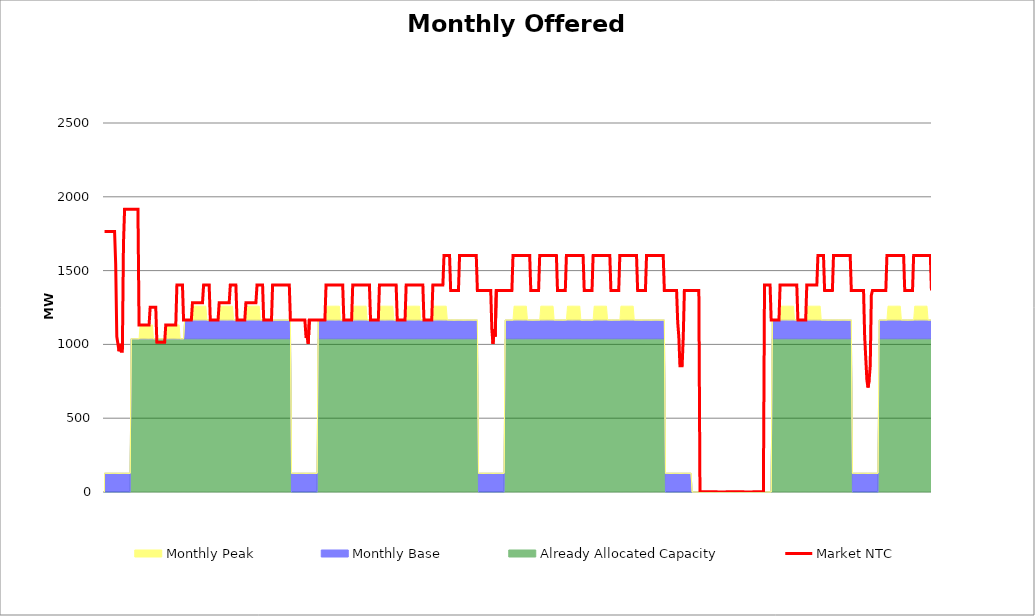
| Category | Market NTC |
|---|---|
| 0 | 1765 |
| 1 | 1765 |
| 2 | 1765 |
| 3 | 1765 |
| 4 | 1765 |
| 5 | 1765 |
| 6 | 1765 |
| 7 | 1765 |
| 8 | 1765 |
| 9 | 1765 |
| 10 | 1545 |
| 11 | 1053 |
| 12 | 1004 |
| 13 | 954 |
| 14 | 1004 |
| 15 | 954 |
| 16 | 954 |
| 17 | 1682 |
| 18 | 1915 |
| 19 | 1915 |
| 20 | 1915 |
| 21 | 1915 |
| 22 | 1915 |
| 23 | 1915 |
| 24 | 1915 |
| 25 | 1915 |
| 26 | 1915 |
| 27 | 1915 |
| 28 | 1915 |
| 29 | 1915 |
| 30 | 1915 |
| 31 | 1132 |
| 32 | 1132 |
| 33 | 1132 |
| 34 | 1132 |
| 35 | 1132 |
| 36 | 1132 |
| 37 | 1132 |
| 38 | 1132 |
| 39 | 1132 |
| 40 | 1132 |
| 41 | 1252 |
| 42 | 1252 |
| 43 | 1252 |
| 44 | 1252 |
| 45 | 1252 |
| 46 | 1252 |
| 47 | 1015 |
| 48 | 1015 |
| 49 | 1015 |
| 50 | 1015 |
| 51 | 1015 |
| 52 | 1015 |
| 53 | 1015 |
| 54 | 1015 |
| 55 | 1132 |
| 56 | 1132 |
| 57 | 1132 |
| 58 | 1132 |
| 59 | 1132 |
| 60 | 1132 |
| 61 | 1132 |
| 62 | 1132 |
| 63 | 1132 |
| 64 | 1132 |
| 65 | 1402 |
| 66 | 1402 |
| 67 | 1402 |
| 68 | 1402 |
| 69 | 1402 |
| 70 | 1402 |
| 71 | 1165 |
| 72 | 1165 |
| 73 | 1165 |
| 74 | 1165 |
| 75 | 1165 |
| 76 | 1165 |
| 77 | 1165 |
| 78 | 1165 |
| 79 | 1282 |
| 80 | 1282 |
| 81 | 1282 |
| 82 | 1282 |
| 83 | 1282 |
| 84 | 1282 |
| 85 | 1282 |
| 86 | 1282 |
| 87 | 1282 |
| 88 | 1282 |
| 89 | 1402 |
| 90 | 1402 |
| 91 | 1402 |
| 92 | 1402 |
| 93 | 1402 |
| 94 | 1402 |
| 95 | 1165 |
| 96 | 1165 |
| 97 | 1165 |
| 98 | 1165 |
| 99 | 1165 |
| 100 | 1165 |
| 101 | 1165 |
| 102 | 1165 |
| 103 | 1282 |
| 104 | 1282 |
| 105 | 1282 |
| 106 | 1282 |
| 107 | 1282 |
| 108 | 1282 |
| 109 | 1282 |
| 110 | 1282 |
| 111 | 1282 |
| 112 | 1282 |
| 113 | 1402 |
| 114 | 1402 |
| 115 | 1402 |
| 116 | 1402 |
| 117 | 1402 |
| 118 | 1402 |
| 119 | 1165 |
| 120 | 1165 |
| 121 | 1165 |
| 122 | 1165 |
| 123 | 1165 |
| 124 | 1165 |
| 125 | 1165 |
| 126 | 1165 |
| 127 | 1282 |
| 128 | 1282 |
| 129 | 1282 |
| 130 | 1282 |
| 131 | 1282 |
| 132 | 1282 |
| 133 | 1282 |
| 134 | 1282 |
| 135 | 1282 |
| 136 | 1282 |
| 137 | 1402 |
| 138 | 1402 |
| 139 | 1402 |
| 140 | 1402 |
| 141 | 1402 |
| 142 | 1402 |
| 143 | 1165 |
| 144 | 1165 |
| 145 | 1165 |
| 146 | 1165 |
| 147 | 1165 |
| 148 | 1165 |
| 149 | 1165 |
| 150 | 1165 |
| 151 | 1402 |
| 152 | 1402 |
| 153 | 1402 |
| 154 | 1402 |
| 155 | 1402 |
| 156 | 1402 |
| 157 | 1402 |
| 158 | 1402 |
| 159 | 1402 |
| 160 | 1402 |
| 161 | 1402 |
| 162 | 1402 |
| 163 | 1402 |
| 164 | 1402 |
| 165 | 1402 |
| 166 | 1402 |
| 167 | 1165 |
| 168 | 1165 |
| 169 | 1165 |
| 170 | 1165 |
| 171 | 1165 |
| 172 | 1165 |
| 173 | 1165 |
| 174 | 1165 |
| 175 | 1165 |
| 176 | 1165 |
| 177 | 1165 |
| 178 | 1165 |
| 179 | 1165 |
| 180 | 1165 |
| 181 | 1053 |
| 182 | 1053 |
| 183 | 1004 |
| 184 | 1165 |
| 185 | 1165 |
| 186 | 1165 |
| 187 | 1165 |
| 188 | 1165 |
| 189 | 1165 |
| 190 | 1165 |
| 191 | 1165 |
| 192 | 1165 |
| 193 | 1165 |
| 194 | 1165 |
| 195 | 1165 |
| 196 | 1165 |
| 197 | 1165 |
| 198 | 1165 |
| 199 | 1402 |
| 200 | 1402 |
| 201 | 1402 |
| 202 | 1402 |
| 203 | 1402 |
| 204 | 1402 |
| 205 | 1402 |
| 206 | 1402 |
| 207 | 1402 |
| 208 | 1402 |
| 209 | 1402 |
| 210 | 1402 |
| 211 | 1402 |
| 212 | 1402 |
| 213 | 1402 |
| 214 | 1402 |
| 215 | 1165 |
| 216 | 1165 |
| 217 | 1165 |
| 218 | 1165 |
| 219 | 1165 |
| 220 | 1165 |
| 221 | 1165 |
| 222 | 1165 |
| 223 | 1402 |
| 224 | 1402 |
| 225 | 1402 |
| 226 | 1402 |
| 227 | 1402 |
| 228 | 1402 |
| 229 | 1402 |
| 230 | 1402 |
| 231 | 1402 |
| 232 | 1402 |
| 233 | 1402 |
| 234 | 1402 |
| 235 | 1402 |
| 236 | 1402 |
| 237 | 1402 |
| 238 | 1402 |
| 239 | 1165 |
| 240 | 1165 |
| 241 | 1165 |
| 242 | 1165 |
| 243 | 1165 |
| 244 | 1165 |
| 245 | 1165 |
| 246 | 1165 |
| 247 | 1402 |
| 248 | 1402 |
| 249 | 1402 |
| 250 | 1402 |
| 251 | 1402 |
| 252 | 1402 |
| 253 | 1402 |
| 254 | 1402 |
| 255 | 1402 |
| 256 | 1402 |
| 257 | 1402 |
| 258 | 1402 |
| 259 | 1402 |
| 260 | 1402 |
| 261 | 1402 |
| 262 | 1402 |
| 263 | 1165 |
| 264 | 1165 |
| 265 | 1165 |
| 266 | 1165 |
| 267 | 1165 |
| 268 | 1165 |
| 269 | 1165 |
| 270 | 1165 |
| 271 | 1402 |
| 272 | 1402 |
| 273 | 1402 |
| 274 | 1402 |
| 275 | 1402 |
| 276 | 1402 |
| 277 | 1402 |
| 278 | 1402 |
| 279 | 1402 |
| 280 | 1402 |
| 281 | 1402 |
| 282 | 1402 |
| 283 | 1402 |
| 284 | 1402 |
| 285 | 1402 |
| 286 | 1402 |
| 287 | 1165 |
| 288 | 1165 |
| 289 | 1165 |
| 290 | 1165 |
| 291 | 1165 |
| 292 | 1165 |
| 293 | 1165 |
| 294 | 1165 |
| 295 | 1402 |
| 296 | 1402 |
| 297 | 1402 |
| 298 | 1402 |
| 299 | 1402 |
| 300 | 1402 |
| 301 | 1402 |
| 302 | 1402 |
| 303 | 1402 |
| 304 | 1402 |
| 305 | 1602 |
| 306 | 1602 |
| 307 | 1602 |
| 308 | 1602 |
| 309 | 1602 |
| 310 | 1602 |
| 311 | 1365 |
| 312 | 1365 |
| 313 | 1365 |
| 314 | 1365 |
| 315 | 1365 |
| 316 | 1365 |
| 317 | 1365 |
| 318 | 1365 |
| 319 | 1602 |
| 320 | 1602 |
| 321 | 1602 |
| 322 | 1602 |
| 323 | 1602 |
| 324 | 1602 |
| 325 | 1602 |
| 326 | 1602 |
| 327 | 1602 |
| 328 | 1602 |
| 329 | 1602 |
| 330 | 1602 |
| 331 | 1602 |
| 332 | 1602 |
| 333 | 1602 |
| 334 | 1602 |
| 335 | 1365 |
| 336 | 1365 |
| 337 | 1365 |
| 338 | 1365 |
| 339 | 1365 |
| 340 | 1365 |
| 341 | 1365 |
| 342 | 1365 |
| 343 | 1365 |
| 344 | 1365 |
| 345 | 1365 |
| 346 | 1365 |
| 347 | 1365 |
| 348 | 1102 |
| 349 | 1004 |
| 350 | 1102 |
| 351 | 1053 |
| 352 | 1365 |
| 353 | 1365 |
| 354 | 1365 |
| 355 | 1365 |
| 356 | 1365 |
| 357 | 1365 |
| 358 | 1365 |
| 359 | 1365 |
| 360 | 1365 |
| 361 | 1365 |
| 362 | 1365 |
| 363 | 1365 |
| 364 | 1365 |
| 365 | 1365 |
| 366 | 1365 |
| 367 | 1602 |
| 368 | 1602 |
| 369 | 1602 |
| 370 | 1602 |
| 371 | 1602 |
| 372 | 1602 |
| 373 | 1602 |
| 374 | 1602 |
| 375 | 1602 |
| 376 | 1602 |
| 377 | 1602 |
| 378 | 1602 |
| 379 | 1602 |
| 380 | 1602 |
| 381 | 1602 |
| 382 | 1602 |
| 383 | 1365 |
| 384 | 1365 |
| 385 | 1365 |
| 386 | 1365 |
| 387 | 1365 |
| 388 | 1365 |
| 389 | 1365 |
| 390 | 1365 |
| 391 | 1602 |
| 392 | 1602 |
| 393 | 1602 |
| 394 | 1602 |
| 395 | 1602 |
| 396 | 1602 |
| 397 | 1602 |
| 398 | 1602 |
| 399 | 1602 |
| 400 | 1602 |
| 401 | 1602 |
| 402 | 1602 |
| 403 | 1602 |
| 404 | 1602 |
| 405 | 1602 |
| 406 | 1602 |
| 407 | 1365 |
| 408 | 1365 |
| 409 | 1365 |
| 410 | 1365 |
| 411 | 1365 |
| 412 | 1365 |
| 413 | 1365 |
| 414 | 1365 |
| 415 | 1602 |
| 416 | 1602 |
| 417 | 1602 |
| 418 | 1602 |
| 419 | 1602 |
| 420 | 1602 |
| 421 | 1602 |
| 422 | 1602 |
| 423 | 1602 |
| 424 | 1602 |
| 425 | 1602 |
| 426 | 1602 |
| 427 | 1602 |
| 428 | 1602 |
| 429 | 1602 |
| 430 | 1602 |
| 431 | 1365 |
| 432 | 1365 |
| 433 | 1365 |
| 434 | 1365 |
| 435 | 1365 |
| 436 | 1365 |
| 437 | 1365 |
| 438 | 1365 |
| 439 | 1602 |
| 440 | 1602 |
| 441 | 1602 |
| 442 | 1602 |
| 443 | 1602 |
| 444 | 1602 |
| 445 | 1602 |
| 446 | 1602 |
| 447 | 1602 |
| 448 | 1602 |
| 449 | 1602 |
| 450 | 1602 |
| 451 | 1602 |
| 452 | 1602 |
| 453 | 1602 |
| 454 | 1602 |
| 455 | 1365 |
| 456 | 1365 |
| 457 | 1365 |
| 458 | 1365 |
| 459 | 1365 |
| 460 | 1365 |
| 461 | 1365 |
| 462 | 1365 |
| 463 | 1602 |
| 464 | 1602 |
| 465 | 1602 |
| 466 | 1602 |
| 467 | 1602 |
| 468 | 1602 |
| 469 | 1602 |
| 470 | 1602 |
| 471 | 1602 |
| 472 | 1602 |
| 473 | 1602 |
| 474 | 1602 |
| 475 | 1602 |
| 476 | 1602 |
| 477 | 1602 |
| 478 | 1602 |
| 479 | 1365 |
| 480 | 1365 |
| 481 | 1365 |
| 482 | 1365 |
| 483 | 1365 |
| 484 | 1365 |
| 485 | 1365 |
| 486 | 1365 |
| 487 | 1602 |
| 488 | 1602 |
| 489 | 1602 |
| 490 | 1602 |
| 491 | 1602 |
| 492 | 1602 |
| 493 | 1602 |
| 494 | 1602 |
| 495 | 1602 |
| 496 | 1602 |
| 497 | 1602 |
| 498 | 1602 |
| 499 | 1602 |
| 500 | 1602 |
| 501 | 1602 |
| 502 | 1602 |
| 503 | 1365 |
| 504 | 1365 |
| 505 | 1365 |
| 506 | 1365 |
| 507 | 1365 |
| 508 | 1365 |
| 509 | 1365 |
| 510 | 1365 |
| 511 | 1365 |
| 512 | 1365 |
| 513 | 1365 |
| 514 | 1365 |
| 515 | 1151 |
| 516 | 1053 |
| 517 | 856 |
| 518 | 856 |
| 519 | 856 |
| 520 | 1053 |
| 521 | 1365 |
| 522 | 1365 |
| 523 | 1365 |
| 524 | 1365 |
| 525 | 1365 |
| 526 | 1365 |
| 527 | 1365 |
| 528 | 1365 |
| 529 | 1365 |
| 530 | 1365 |
| 531 | 1365 |
| 532 | 1365 |
| 533 | 1365 |
| 534 | 1365 |
| 535 | 2 |
| 536 | 2 |
| 537 | 2 |
| 538 | 2 |
| 539 | 2 |
| 540 | 2 |
| 541 | 2 |
| 542 | 2 |
| 543 | 2 |
| 544 | 2 |
| 545 | 2 |
| 546 | 2 |
| 547 | 2 |
| 548 | 2 |
| 549 | 2 |
| 550 | 2 |
| 551 | 0 |
| 552 | 0 |
| 553 | 0 |
| 554 | 0 |
| 555 | 0 |
| 556 | 0 |
| 557 | 0 |
| 558 | 0 |
| 559 | 2 |
| 560 | 2 |
| 561 | 2 |
| 562 | 2 |
| 563 | 2 |
| 564 | 2 |
| 565 | 2 |
| 566 | 2 |
| 567 | 2 |
| 568 | 2 |
| 569 | 2 |
| 570 | 2 |
| 571 | 2 |
| 572 | 2 |
| 573 | 2 |
| 574 | 2 |
| 575 | 0 |
| 576 | 0 |
| 577 | 0 |
| 578 | 0 |
| 579 | 0 |
| 580 | 0 |
| 581 | 0 |
| 582 | 0 |
| 583 | 2 |
| 584 | 2 |
| 585 | 2 |
| 586 | 2 |
| 587 | 2 |
| 588 | 2 |
| 589 | 2 |
| 590 | 2 |
| 591 | 2 |
| 592 | 2 |
| 593 | 1402 |
| 594 | 1402 |
| 595 | 1402 |
| 596 | 1402 |
| 597 | 1402 |
| 598 | 1402 |
| 599 | 1165 |
| 600 | 1165 |
| 601 | 1165 |
| 602 | 1165 |
| 603 | 1165 |
| 604 | 1165 |
| 605 | 1165 |
| 606 | 1165 |
| 607 | 1402 |
| 608 | 1402 |
| 609 | 1402 |
| 610 | 1402 |
| 611 | 1402 |
| 612 | 1402 |
| 613 | 1402 |
| 614 | 1402 |
| 615 | 1402 |
| 616 | 1402 |
| 617 | 1402 |
| 618 | 1402 |
| 619 | 1402 |
| 620 | 1402 |
| 621 | 1402 |
| 622 | 1402 |
| 623 | 1165 |
| 624 | 1165 |
| 625 | 1165 |
| 626 | 1165 |
| 627 | 1165 |
| 628 | 1165 |
| 629 | 1165 |
| 630 | 1165 |
| 631 | 1402 |
| 632 | 1402 |
| 633 | 1402 |
| 634 | 1402 |
| 635 | 1402 |
| 636 | 1402 |
| 637 | 1402 |
| 638 | 1402 |
| 639 | 1402 |
| 640 | 1402 |
| 641 | 1602 |
| 642 | 1602 |
| 643 | 1602 |
| 644 | 1602 |
| 645 | 1602 |
| 646 | 1602 |
| 647 | 1365 |
| 648 | 1365 |
| 649 | 1365 |
| 650 | 1365 |
| 651 | 1365 |
| 652 | 1365 |
| 653 | 1365 |
| 654 | 1365 |
| 655 | 1602 |
| 656 | 1602 |
| 657 | 1602 |
| 658 | 1602 |
| 659 | 1602 |
| 660 | 1602 |
| 661 | 1602 |
| 662 | 1602 |
| 663 | 1602 |
| 664 | 1602 |
| 665 | 1602 |
| 666 | 1602 |
| 667 | 1602 |
| 668 | 1602 |
| 669 | 1602 |
| 670 | 1602 |
| 671 | 1365 |
| 672 | 1365 |
| 673 | 1365 |
| 674 | 1365 |
| 675 | 1365 |
| 676 | 1365 |
| 677 | 1365 |
| 678 | 1365 |
| 679 | 1365 |
| 680 | 1365 |
| 681 | 1365 |
| 682 | 1365 |
| 683 | 1053 |
| 684 | 905 |
| 685 | 758 |
| 686 | 708 |
| 687 | 758 |
| 688 | 856 |
| 689 | 1333 |
| 690 | 1365 |
| 691 | 1365 |
| 692 | 1365 |
| 693 | 1365 |
| 694 | 1365 |
| 695 | 1365 |
| 696 | 1365 |
| 697 | 1365 |
| 698 | 1365 |
| 699 | 1365 |
| 700 | 1365 |
| 701 | 1365 |
| 702 | 1365 |
| 703 | 1602 |
| 704 | 1602 |
| 705 | 1602 |
| 706 | 1602 |
| 707 | 1602 |
| 708 | 1602 |
| 709 | 1602 |
| 710 | 1602 |
| 711 | 1602 |
| 712 | 1602 |
| 713 | 1602 |
| 714 | 1602 |
| 715 | 1602 |
| 716 | 1602 |
| 717 | 1602 |
| 718 | 1602 |
| 719 | 1365 |
| 720 | 1365 |
| 721 | 1365 |
| 722 | 1365 |
| 723 | 1365 |
| 724 | 1365 |
| 725 | 1365 |
| 726 | 1365 |
| 727 | 1602 |
| 728 | 1602 |
| 729 | 1602 |
| 730 | 1602 |
| 731 | 1602 |
| 732 | 1602 |
| 733 | 1602 |
| 734 | 1602 |
| 735 | 1602 |
| 736 | 1602 |
| 737 | 1602 |
| 738 | 1602 |
| 739 | 1602 |
| 740 | 1602 |
| 741 | 1602 |
| 742 | 1602 |
| 743 | 1365 |